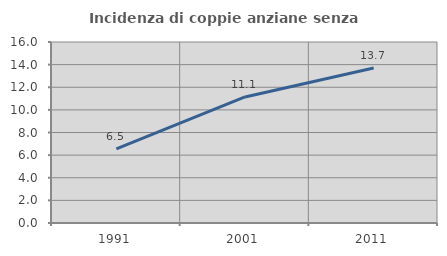
| Category | Incidenza di coppie anziane senza figli  |
|---|---|
| 1991.0 | 6.546 |
| 2001.0 | 11.14 |
| 2011.0 | 13.699 |